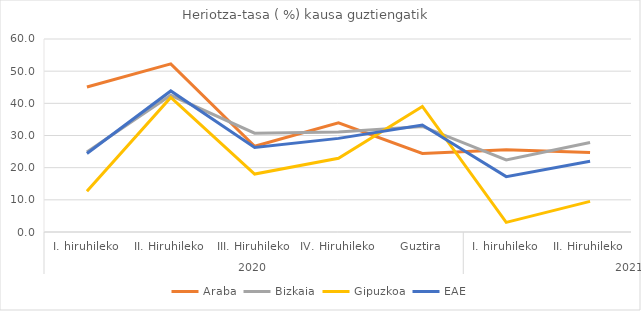
| Category | Araba | Bizkaia | Gipuzkoa | EAE |
|---|---|---|---|---|
| 0 | 45.059 | 24.886 | 12.637 | 24.387 |
| 1 | 52.263 | 42.505 | 41.849 | 43.85 |
| 2 | 26.655 | 30.709 | 18.014 | 26.257 |
| 3 | 33.911 | 31.056 | 22.931 | 29.109 |
| 4 | 24.43 | 32.823 | 39.035 | 33.252 |
| 5 | 25.582 | 22.383 | 2.98 | 17.215 |
| 6 | 24.717 | 27.81 | 9.516 | 21.996 |